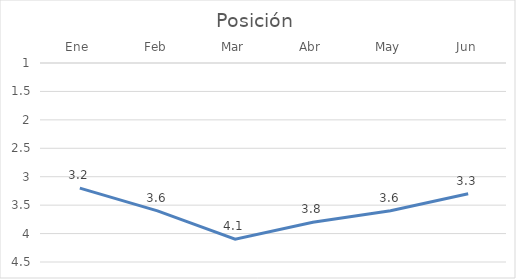
| Category | Posición |
|---|---|
| Ene | 3.2 |
| Feb | 3.6 |
| Mar | 4.1 |
| Abr | 3.8 |
| May | 3.6 |
| Jun | 3.3 |